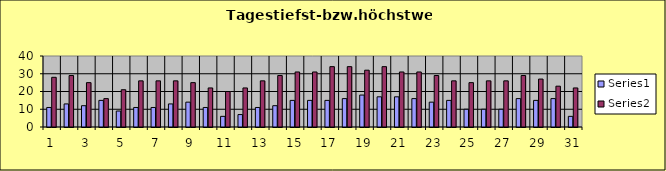
| Category | Series 0 | Series 1 |
|---|---|---|
| 0 | 11 | 28 |
| 1 | 13 | 29 |
| 2 | 12 | 25 |
| 3 | 15 | 16 |
| 4 | 9 | 21 |
| 5 | 11 | 26 |
| 6 | 11 | 26 |
| 7 | 13 | 26 |
| 8 | 14 | 25 |
| 9 | 11 | 22 |
| 10 | 6 | 20 |
| 11 | 7 | 22 |
| 12 | 11 | 26 |
| 13 | 12 | 29 |
| 14 | 15 | 31 |
| 15 | 15 | 31 |
| 16 | 15 | 34 |
| 17 | 16 | 34 |
| 18 | 18 | 32 |
| 19 | 17 | 34 |
| 20 | 17 | 31 |
| 21 | 16 | 31 |
| 22 | 14 | 29 |
| 23 | 15 | 26 |
| 24 | 10 | 25 |
| 25 | 10 | 26 |
| 26 | 10 | 26 |
| 27 | 16 | 29 |
| 28 | 15 | 27 |
| 29 | 16 | 23 |
| 30 | 6 | 22 |